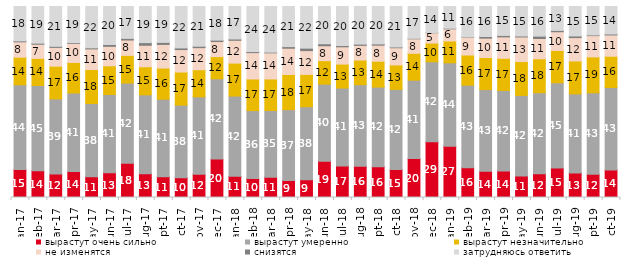
| Category | вырастут очень сильно | вырастут умеренно | вырастут незначительно | не изменятся | снизятся | затрудняюсь ответить |
|---|---|---|---|---|---|---|
| 2017-01-01 | 14.65 | 44.35 | 14.45 | 8.05 | 0.5 | 18 |
| 2017-02-01 | 13.95 | 44.7 | 14.2 | 7.4 | 0.55 | 19.2 |
| 2017-03-01 | 12.25 | 39.35 | 17.15 | 9.85 | 0.55 | 20.85 |
| 2017-04-01 | 13.55 | 41.15 | 16 | 9.95 | 0.4 | 18.95 |
| 2017-05-01 | 10.9 | 38.3 | 17.8 | 10.8 | 0.55 | 21.65 |
| 2017-06-01 | 13 | 40.95 | 15 | 10.2 | 0.95 | 19.9 |
| 2017-07-01 | 17.95 | 41.95 | 14.5 | 8.05 | 0.85 | 16.7 |
| 2017-08-01 | 12.5 | 41.25 | 14.7 | 11.25 | 1.4 | 18.9 |
| 2017-09-01 | 10.9 | 40.55 | 16.3 | 12.4 | 1.05 | 18.8 |
| 2017-10-01 | 10.4 | 37.95 | 17.35 | 11.75 | 0.85 | 21.7 |
| 2017-11-01 | 12.2 | 40.5 | 14.2 | 11.55 | 0.75 | 20.8 |
| 2017-12-01 | 20.1 | 42.05 | 11.6 | 7.9 | 0.75 | 17.6 |
| 2018-01-01 | 11.1 | 42 | 17.25 | 11.95 | 0.7 | 17 |
| 2018-02-01 | 10 | 35.5 | 16.55 | 13.8 | 0.55 | 23.6 |
| 2018-03-01 | 10.65 | 34.9 | 16.5 | 13.7 | 0.35 | 23.9 |
| 2018-04-01 | 8.95 | 37.05 | 18.4 | 13.75 | 0.85 | 21 |
| 2018-05-01 | 9.3 | 38.2 | 16.95 | 12.45 | 1.3 | 21.8 |
| 2018-06-01 | 18.95 | 40.4 | 12.3 | 7.8 | 1.05 | 19.5 |
| 2018-07-01 | 16.55 | 40.75 | 12.55 | 9.05 | 0.65 | 20.45 |
| 2018-08-01 | 16.35 | 42.7 | 12.9 | 7.7 | 0.65 | 19.7 |
| 2018-09-01 | 16.05 | 41.75 | 13.55 | 8.4 | 0.65 | 19.6 |
| 2018-10-01 | 14.6 | 42 | 12.8 | 9 | 0.4 | 21.2 |
| 2018-11-01 | 20.359 | 41.068 | 14.072 | 7.585 | 0.25 | 16.667 |
| 2018-12-01 | 29.25 | 41.8 | 9.8 | 5.4 | 0.1 | 13.65 |
| 2019-01-01 | 26.85 | 43.65 | 11.45 | 6.35 | 0.3 | 11.4 |
| 2019-02-01 | 15.6 | 43.2 | 15.8 | 9.35 | 0.15 | 15.9 |
| 2019-03-01 | 13.774 | 42.715 | 16.808 | 10.144 | 0.845 | 15.714 |
| 2019-04-01 | 13.911 | 42.129 | 16.832 | 11.238 | 0.743 | 15.149 |
| 2019-05-01 | 11.293 | 42.15 | 17.732 | 12.878 | 0.495 | 15.453 |
| 2019-06-01 | 12.419 | 42.444 | 17.756 | 10.623 | 1.247 | 15.511 |
| 2019-07-01 | 15.396 | 44.653 | 16.931 | 9.802 | 0.693 | 12.525 |
| 2019-08-01 | 12.887 | 41.359 | 17.233 | 12.238 | 0.849 | 15.435 |
| 2019-09-01 | 12.228 | 42.574 | 18.812 | 11.139 | 0.347 | 14.901 |
| 2019-10-01 | 14.455 | 43.119 | 16.386 | 11.139 | 0.495 | 14.406 |